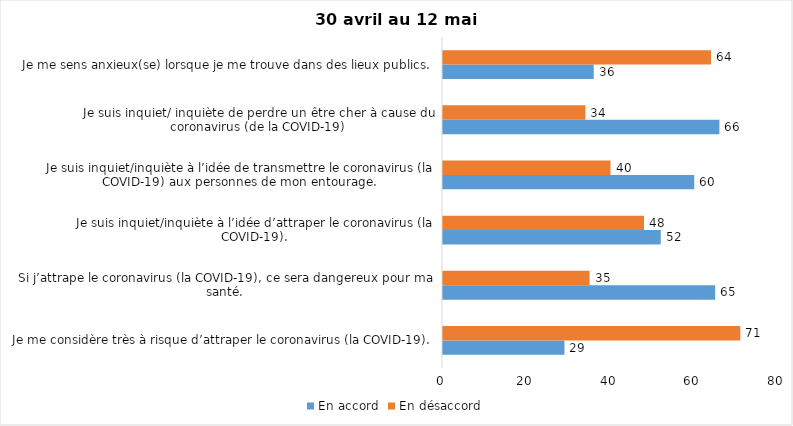
| Category | En accord | En désaccord |
|---|---|---|
| Je me considère très à risque d’attraper le coronavirus (la COVID-19). | 29 | 71 |
| Si j’attrape le coronavirus (la COVID-19), ce sera dangereux pour ma santé. | 65 | 35 |
| Je suis inquiet/inquiète à l’idée d’attraper le coronavirus (la COVID-19). | 52 | 48 |
| Je suis inquiet/inquiète à l’idée de transmettre le coronavirus (la COVID-19) aux personnes de mon entourage. | 60 | 40 |
| Je suis inquiet/ inquiète de perdre un être cher à cause du coronavirus (de la COVID-19) | 66 | 34 |
| Je me sens anxieux(se) lorsque je me trouve dans des lieux publics. | 36 | 64 |